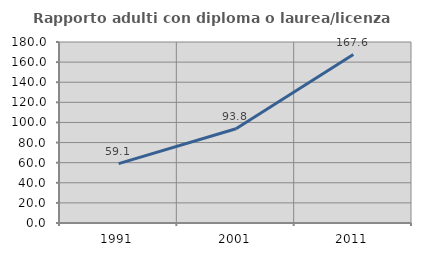
| Category | Rapporto adulti con diploma o laurea/licenza media  |
|---|---|
| 1991.0 | 59.091 |
| 2001.0 | 93.75 |
| 2011.0 | 167.568 |